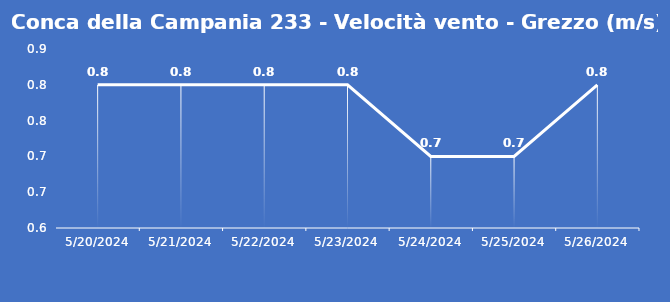
| Category | Conca della Campania 233 - Velocità vento - Grezzo (m/s) |
|---|---|
| 5/20/24 | 0.8 |
| 5/21/24 | 0.8 |
| 5/22/24 | 0.8 |
| 5/23/24 | 0.8 |
| 5/24/24 | 0.7 |
| 5/25/24 | 0.7 |
| 5/26/24 | 0.8 |